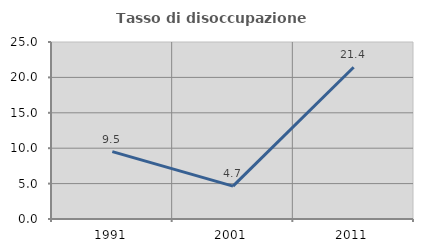
| Category | Tasso di disoccupazione giovanile  |
|---|---|
| 1991.0 | 9.524 |
| 2001.0 | 4.651 |
| 2011.0 | 21.429 |